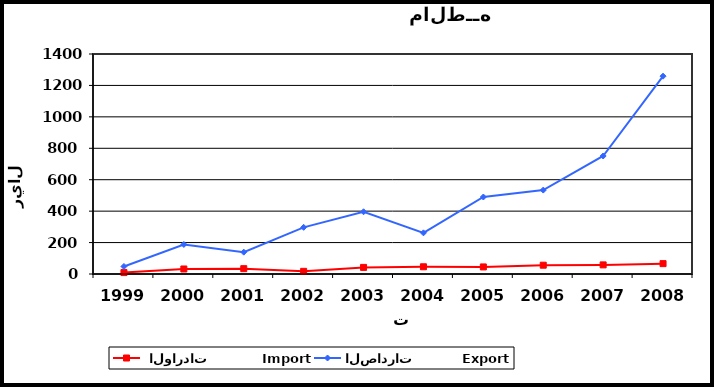
| Category |  الواردات           Import | الصادرات          Export |
|---|---|---|
| 1999.0 | 9 | 48 |
| 2000.0 | 32 | 188 |
| 2001.0 | 34 | 139 |
| 2002.0 | 17 | 297 |
| 2003.0 | 42 | 396 |
| 2004.0 | 46 | 262 |
| 2005.0 | 45 | 490 |
| 2006.0 | 56 | 534 |
| 2007.0 | 58 | 751 |
| 2008.0 | 66 | 1259 |